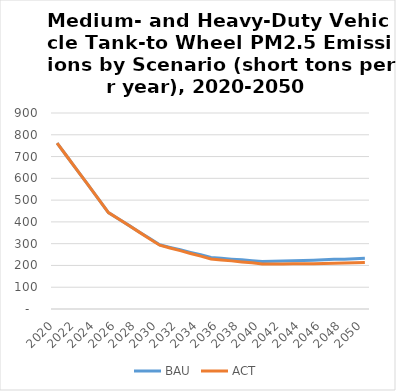
| Category | BAU | ACT |
|---|---|---|
| 2020.0 | 762 | 762 |
| 2021.0 | 698 | 698 |
| 2022.0 | 634 | 634 |
| 2023.0 | 571 | 571 |
| 2024.0 | 507 | 507 |
| 2025.0 | 443 | 443 |
| 2026.0 | 413 | 413 |
| 2027.0 | 384 | 383 |
| 2028.0 | 354 | 353 |
| 2029.0 | 325 | 323 |
| 2030.0 | 295 | 293 |
| 2031.0 | 283 | 280 |
| 2032.0 | 272 | 268 |
| 2033.0 | 260 | 255 |
| 2034.0 | 249 | 243 |
| 2035.0 | 237 | 230 |
| 2036.0 | 233 | 225 |
| 2037.0 | 229 | 221 |
| 2038.0 | 226 | 216 |
| 2039.0 | 222 | 212 |
| 2040.0 | 218 | 207 |
| 2041.0 | 219 | 207 |
| 2042.0 | 220 | 207 |
| 2043.0 | 222 | 208 |
| 2044.0 | 223 | 208 |
| 2045.0 | 224 | 208 |
| 2046.0 | 226 | 209 |
| 2047.0 | 228 | 210 |
| 2048.0 | 229 | 211 |
| 2049.0 | 231 | 212 |
| 2050.0 | 233 | 213 |